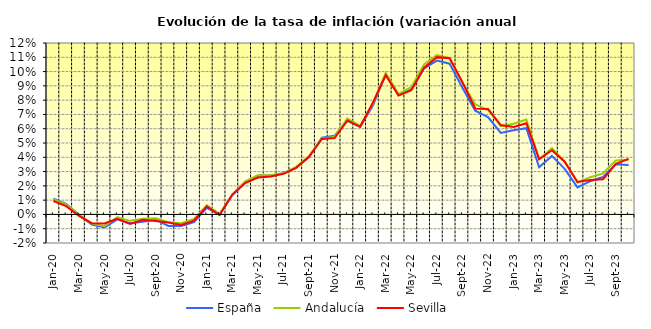
| Category | España | Andalucía | Sevilla |
|---|---|---|---|
| 2020-01-01 | 0.011 | 0.01 | 0.009 |
| 2020-02-01 | 0.007 | 0.007 | 0.006 |
| 2020-03-01 | 0 | 0 | -0.001 |
| 2020-04-01 | -0.007 | -0.006 | -0.006 |
| 2020-05-01 | -0.009 | -0.008 | -0.006 |
| 2020-06-01 | -0.003 | -0.002 | -0.003 |
| 2020-07-01 | -0.006 | -0.004 | -0.007 |
| 2020-08-01 | -0.005 | -0.003 | -0.004 |
| 2020-09-01 | -0.004 | -0.003 | -0.005 |
| 2020-10-01 | -0.008 | -0.005 | -0.006 |
| 2020-11-01 | -0.008 | -0.006 | -0.007 |
| 2020-12-01 | -0.005 | -0.003 | -0.004 |
| 2021-01-01 | 0.005 | 0.006 | 0.006 |
| 2021-02-01 | 0 | 0 | 0 |
| 2021-03-01 | 0.013 | 0.014 | 0.014 |
| 2021-04-01 | 0.022 | 0.023 | 0.022 |
| 2021-05-01 | 0.027 | 0.027 | 0.026 |
| 2021-06-01 | 0.027 | 0.027 | 0.027 |
| 2021-07-01 | 0.029 | 0.029 | 0.028 |
| 2021-08-01 | 0.033 | 0.033 | 0.033 |
| 2021-09-01 | 0.04 | 0.041 | 0.04 |
| 2021-10-01 | 0.054 | 0.053 | 0.053 |
| 2021-11-01 | 0.055 | 0.054 | 0.053 |
| 2021-12-01 | 0.065 | 0.067 | 0.066 |
| 2022-01-01 | 0.061 | 0.062 | 0.061 |
| 2022-02-01 | 0.076 | 0.078 | 0.078 |
| 2022-03-01 | 0.098 | 0.099 | 0.098 |
| 2022-04-01 | 0.083 | 0.084 | 0.083 |
| 2022-05-01 | 0.087 | 0.089 | 0.087 |
| 2022-06-01 | 0.102 | 0.105 | 0.103 |
| 2022-07-01 | 0.108 | 0.112 | 0.11 |
| 2022-08-01 | 0.105 | 0.109 | 0.109 |
| 2022-09-01 | 0.089 | 0.092 | 0.092 |
| 2022-10-01 | 0.073 | 0.077 | 0.074 |
| 2022-11-01 | 0.068 | 0.073 | 0.074 |
| 2022-12-01 | 0.057 | 0.062 | 0.063 |
| 2023-01-01 | 0.059 | 0.063 | 0.061 |
| 2023-02-01 | 0.06 | 0.066 | 0.064 |
| 2023-03-01 | 0.033 | 0.039 | 0.039 |
| 2023-04-01 | 0.041 | 0.046 | 0.045 |
| 2023-05-01 | 0.032 | 0.037 | 0.037 |
| 2023-06-01 | 0.019 | 0.022 | 0.023 |
| 2023-07-01 | 0.023 | 0.026 | 0.024 |
| 2023-08-01 | 0.026 | 0.029 | 0.025 |
| 2023-09-01 | 0.035 | 0.038 | 0.035 |
| 2023-10-01 | 0.035 | 0.038 | 0.039 |